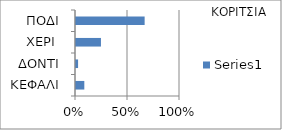
| Category | Series 0 |
|---|---|
| ΚΕΦΑΛΙ | 0.08 |
| ΔΟΝΤΙ | 0.02 |
| ΧΕΡΙ  | 0.24 |
| ΠΟΔΙ | 0.66 |